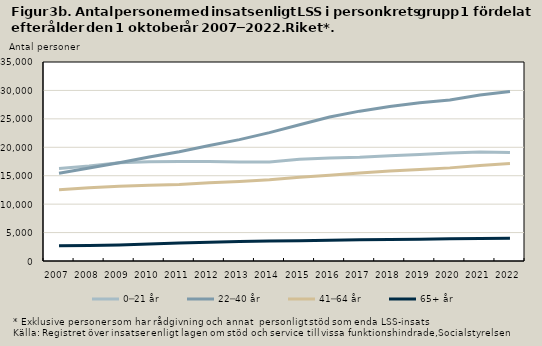
| Category | 0─21 år | 22─40 år | 41─64 år | 65+ år |
|---|---|---|---|---|
| 2007.0 | 16253 | 15431 | 12536 | 2668 |
| 2008.0 | 16689 | 16353 | 12866 | 2726 |
| 2009.0 | 17292 | 17266 | 13150 | 2821 |
| 2010.0 | 17475 | 18291 | 13301 | 3006 |
| 2011.0 | 17485 | 19231 | 13462 | 3163 |
| 2012.0 | 17486 | 20318 | 13745 | 3287 |
| 2013.0 | 17432 | 21345 | 14000 | 3409 |
| 2014.0 | 17422 | 22576 | 14284 | 3520 |
| 2015.0 | 17895 | 23963 | 14747 | 3580 |
| 2016.0 | 18130 | 25324 | 15094 | 3663 |
| 2017.0 | 18240 | 26356 | 15479 | 3753 |
| 2018.0 | 18515 | 27167 | 15831 | 3762 |
| 2019.0 | 18741 | 27850 | 16113 | 3842 |
| 2020.0 | 18979 | 28319 | 16379 | 3898 |
| 2021.0 | 19179 | 29202 | 16801 | 3942 |
| 2022.0 | 19103 | 29818 | 17139 | 3989 |